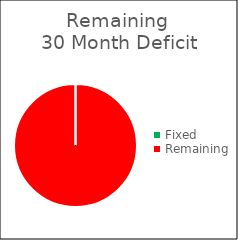
| Category | Series 0 |
|---|---|
| Fixed | 0 |
| Remaining | 34.5 |